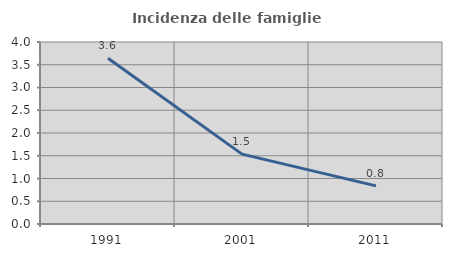
| Category | Incidenza delle famiglie numerose |
|---|---|
| 1991.0 | 3.641 |
| 2001.0 | 1.536 |
| 2011.0 | 0.839 |